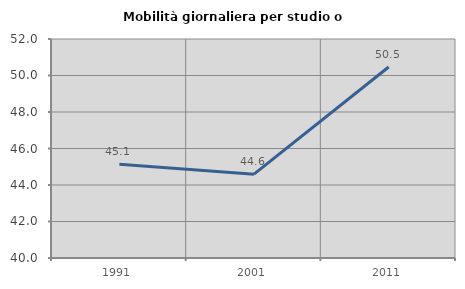
| Category | Mobilità giornaliera per studio o lavoro |
|---|---|
| 1991.0 | 45.133 |
| 2001.0 | 44.592 |
| 2011.0 | 50.466 |